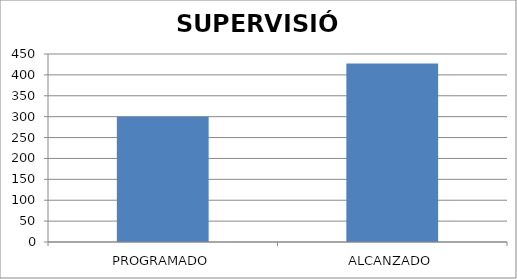
| Category | SUPERVISIÓN |
|---|---|
| PROGRAMADO | 300 |
| ALCANZADO | 427 |